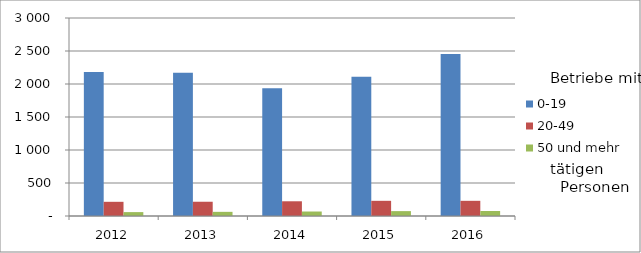
| Category | 0-19 | 20-49 | 50 und mehr |
|---|---|---|---|
| 2012.0 | 2181 | 215 | 59 |
| 2013.0 | 2169 | 216 | 63 |
| 2014.0 | 1936 | 223 | 68 |
| 2015.0 | 2111 | 230 | 74 |
| 2016.0 | 2456 | 230 | 76 |